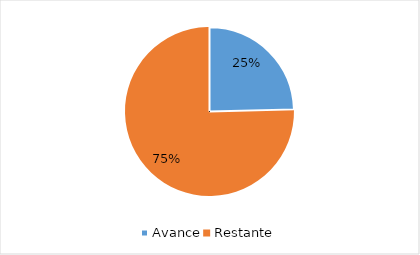
| Category | Series 0 |
|---|---|
| Avance | 0.246 |
| Restante | 0.754 |